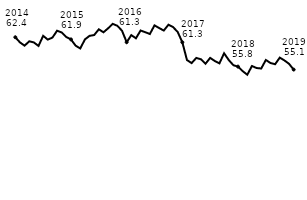
| Category | Series 0 |
|---|---|
| 1905-07-06 | 62.444 |
| nan | 61.27 |
| nan | 60.53 |
| nan | 61.521 |
| nan | 61.257 |
| nan | 60.473 |
| nan | 62.762 |
| nan | 61.91 |
| nan | 62.366 |
| nan | 63.931 |
| nan | 63.528 |
| nan | 62.477 |
| 1905-07-07 | 61.949 |
| nan | 60.525 |
| nan | 59.892 |
| nan | 61.955 |
| nan | 62.759 |
| nan | 62.945 |
| nan | 64.25 |
| nan | 63.568 |
| nan | 64.477 |
| nan | 65.483 |
| nan | 65.042 |
| nan | 63.921 |
| 1905-07-08 | 61.316 |
| nan | 62.92 |
| nan | 62.203 |
| nan | 63.978 |
| nan | 63.59 |
| nan | 63.184 |
| nan | 65.144 |
| nan | 64.541 |
| nan | 63.965 |
| nan | 65.285 |
| nan | 64.754 |
| nan | 63.643 |
| 1905-07-09 | 61.304 |
| nan | 57.26 |
| nan | 56.571 |
| nan | 57.74 |
| nan | 57.443 |
| nan | 56.438 |
| nan | 57.752 |
| nan | 57.05 |
| nan | 56.518 |
| nan | 58.802 |
| nan | 57.272 |
| nan | 56.092 |
| 1905-07-10 | 55.768 |
| nan | 54.747 |
| nan | 53.928 |
| nan | 55.907 |
| nan | 55.45 |
| nan | 55.335 |
| nan | 57.277 |
| nan | 56.592 |
| nan | 56.312 |
| nan | 57.816 |
| nan | 57.18 |
| nan | 56.405 |
| 1905-07-11 | 55.088 |